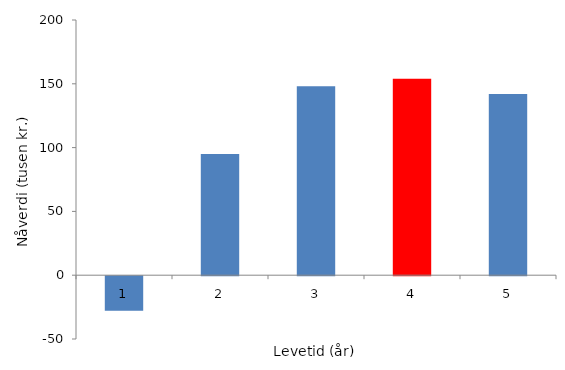
| Category | Series 0 |
|---|---|
| 0 | -27 |
| 1 | 95 |
| 2 | 148 |
| 3 | 154 |
| 4 | 142 |